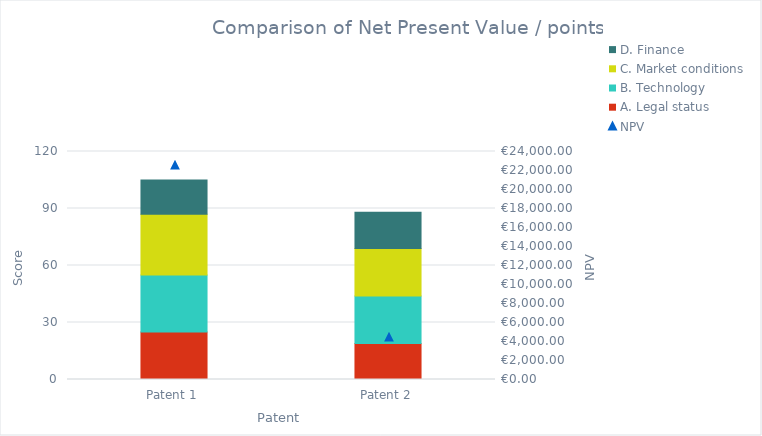
| Category | A. Legal status | B. Technology | C. Market conditions | D. Finance |
|---|---|---|---|---|
| Patent 1 | 25 | 30 | 32 | 18 |
| Patent 2 | 19 | 25 | 25 | 19 |